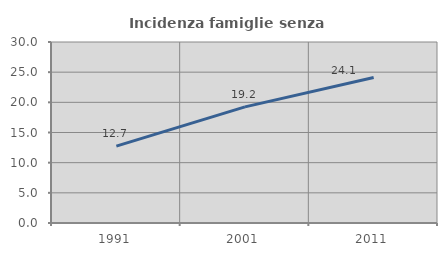
| Category | Incidenza famiglie senza nuclei |
|---|---|
| 1991.0 | 12.732 |
| 2001.0 | 19.246 |
| 2011.0 | 24.119 |